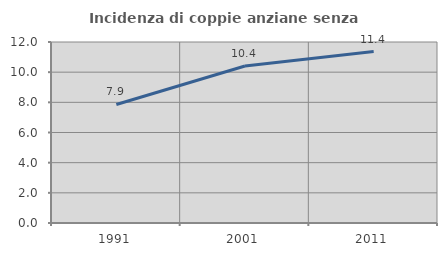
| Category | Incidenza di coppie anziane senza figli  |
|---|---|
| 1991.0 | 7.859 |
| 2001.0 | 10.407 |
| 2011.0 | 11.368 |